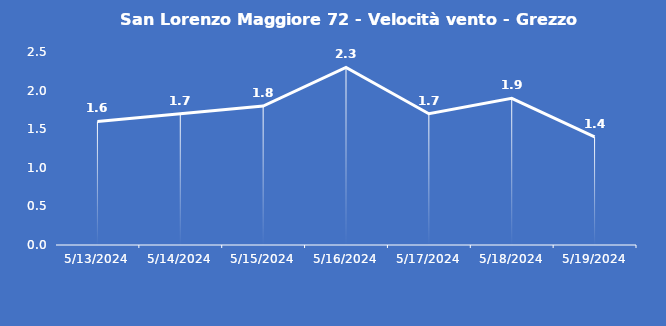
| Category | San Lorenzo Maggiore 72 - Velocità vento - Grezzo (m/s) |
|---|---|
| 5/13/24 | 1.6 |
| 5/14/24 | 1.7 |
| 5/15/24 | 1.8 |
| 5/16/24 | 2.3 |
| 5/17/24 | 1.7 |
| 5/18/24 | 1.9 |
| 5/19/24 | 1.4 |